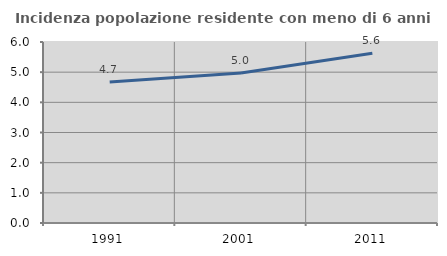
| Category | Incidenza popolazione residente con meno di 6 anni |
|---|---|
| 1991.0 | 4.675 |
| 2001.0 | 4.976 |
| 2011.0 | 5.624 |